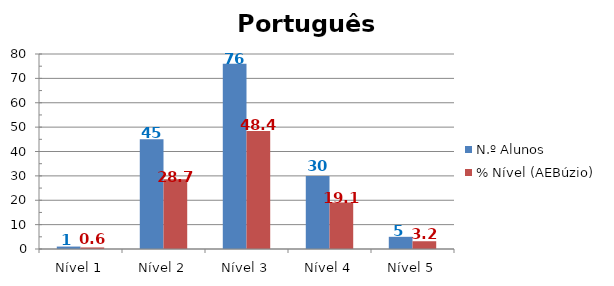
| Category | N.º Alunos | % Nível (AEBúzio) |
|---|---|---|
| Nível 1 | 1 | 0.637 |
| Nível 2 | 45 | 28.662 |
| Nível 3 | 76 | 48.408 |
| Nível 4 | 30 | 19.108 |
| Nível 5 | 5 | 3.185 |